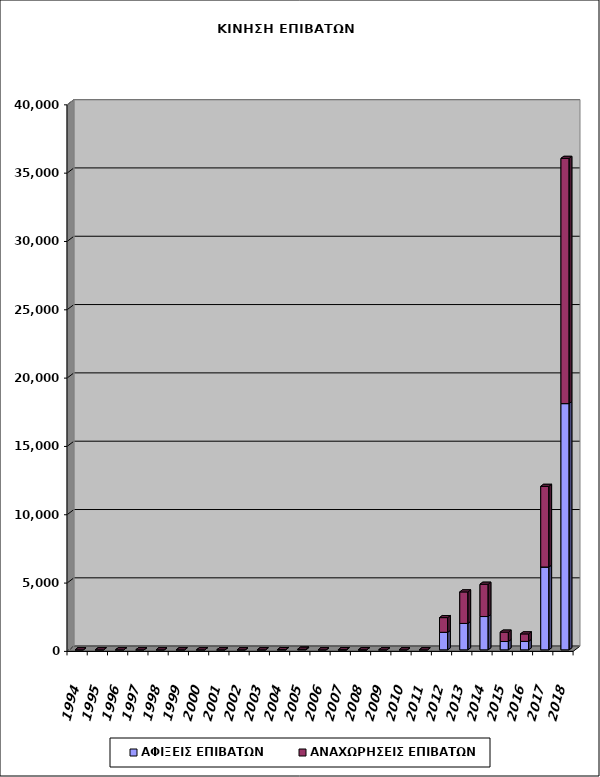
| Category | ΑΦΙΞΕΙΣ ΕΠΙΒΑΤΩΝ | ΑΝΑΧΩΡΗΣΕΙΣ ΕΠΙΒΑΤΩΝ |
|---|---|---|
| 1994.0 | 0 | 0 |
| 1995.0 | 0 | 0 |
| 1996.0 | 0 | 0 |
| 1997.0 | 0 | 0 |
| 1998.0 | 0 | 0 |
| 1999.0 | 0 | 0 |
| 2000.0 | 0 | 0 |
| 2001.0 | 0 | 0 |
| 2002.0 | 0 | 0 |
| 2003.0 | 0 | 0 |
| 2004.0 | 17 | 0 |
| 2005.0 | 41 | 0 |
| 2006.0 | 0 | 0 |
| 2007.0 | 0 | 14 |
| 2008.0 | 5 | 0 |
| 2009.0 | 0 | 0 |
| 2010.0 | 0 | 0 |
| 2011.0 | 0 | 0 |
| 2012.0 | 1282 | 1075 |
| 2013.0 | 1932 | 2306 |
| 2014.0 | 2437 | 2363 |
| 2015.0 | 611 | 684 |
| 2016.0 | 622 | 544 |
| 2017.0 | 6061 | 5902 |
| 2018.0 | 18021 | 17945 |